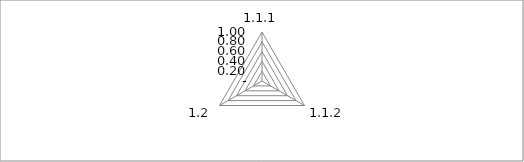
| Category | Series 0 |
|---|---|
| 1.1.1 | 0 |
| 1.1.2 | 0 |
| 1.2 | 0 |